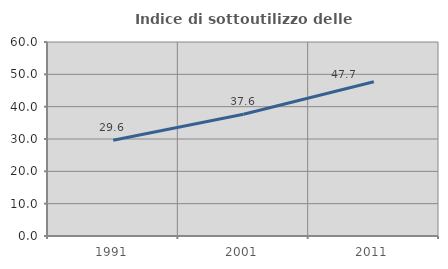
| Category | Indice di sottoutilizzo delle abitazioni  |
|---|---|
| 1991.0 | 29.636 |
| 2001.0 | 37.64 |
| 2011.0 | 47.727 |